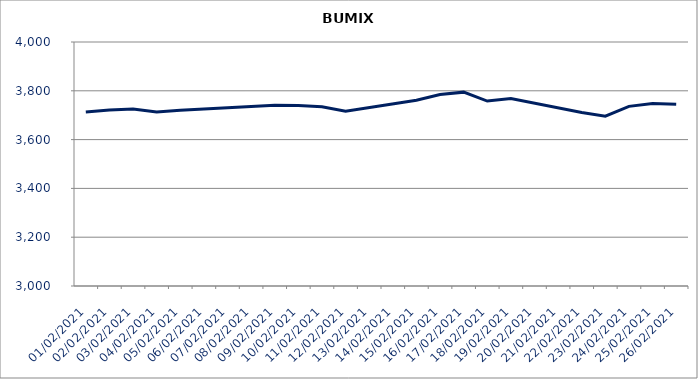
| Category | BUMIX |
|---|---|
| 01/02/2021 | 3713.3 |
| 02/02/2021 | 3721.16 |
| 03/02/2021 | 3725.78 |
| 04/02/2021 | 3713.5 |
| 05/02/2021 | 3720.14 |
| 08/02/2021 | 3735.17 |
| 09/02/2021 | 3741.05 |
| 10/02/2021 | 3739.45 |
| 11/02/2021 | 3735 |
| 12/02/2021 | 3716.17 |
| 15/02/2021 | 3761.64 |
| 16/02/2021 | 3784.64 |
| 17/02/2021 | 3794.47 |
| 18/02/2021 | 3757.86 |
| 19/02/2021 | 3768.62 |
| 22/02/2021 | 3711.29 |
| 23/02/2021 | 3696.27 |
| 24/02/2021 | 3736.18 |
| 25/02/2021 | 3747.99 |
| 26/02/2021 | 3744.67 |